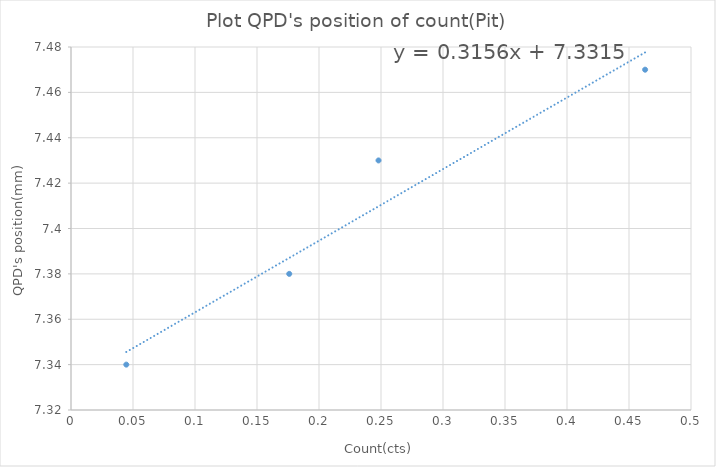
| Category | Series 0 |
|---|---|
| 0.0446 | 7.34 |
| 0.176 | 7.38 |
| 0.248 | 7.43 |
| 0.463 | 7.47 |